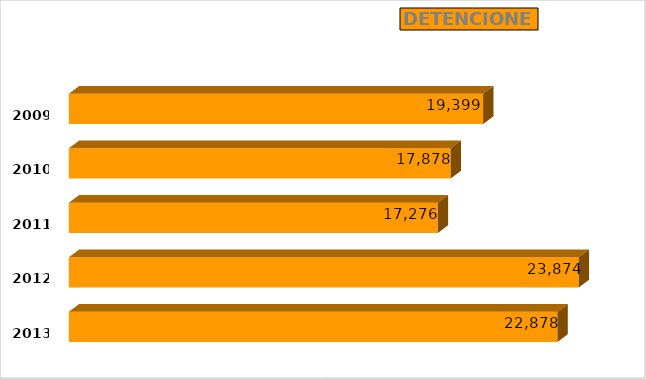
| Category | decomisos |
|---|---|
| 2009.0 | 19399 |
| 2010.0 | 17878 |
| 2011.0 | 17276 |
| 2012.0 | 23874 |
| 2013.0 | 22878 |